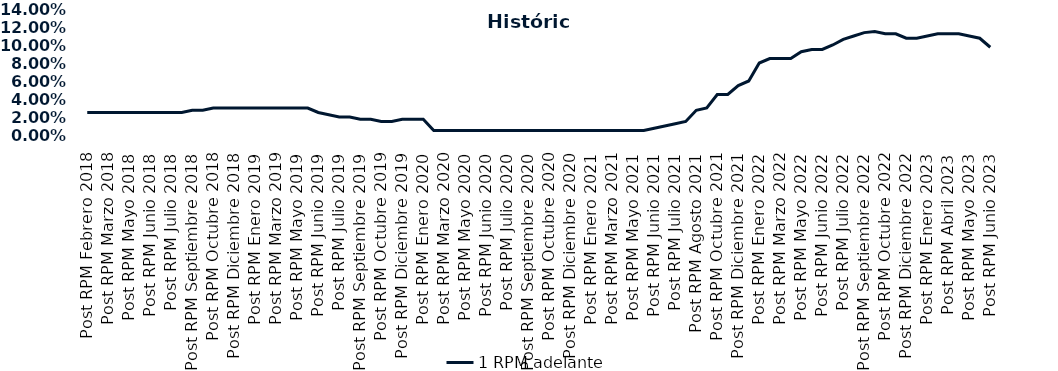
| Category | 1 RPM adelante |
|---|---|
| Post RPM Febrero 2018 | 0.025 |
| Pre RPM Marzo 2018 | 0.025 |
| Post RPM Marzo 2018 | 0.025 |
| Pre RPM Mayo 2018 | 0.025 |
| Post RPM Mayo 2018 | 0.025 |
| Pre RPM Junio 2018 | 0.025 |
| Post RPM Junio 2018 | 0.025 |
| Pre RPM Julio 2018 | 0.025 |
| Post RPM Julio 2018 | 0.025 |
| Pre RPM Septiembre 2018 | 0.025 |
| Post RPM Septiembre 2018 | 0.028 |
| Pre RPM Octubre 2018 | 0.028 |
| Post RPM Octubre 2018 | 0.03 |
| Pre RPM Diciembre 2018 | 0.03 |
| Post RPM Diciembre 2018 | 0.03 |
| Pre RPM Enero 2019 | 0.03 |
| Post RPM Enero 2019 | 0.03 |
| Pre RPM Marzo 2019 | 0.03 |
| Post RPM Marzo 2019 | 0.03 |
| Pre RPM Mayo 2019 | 0.03 |
| Post RPM Mayo 2019 | 0.03 |
| Pre RPM Junio 2019 | 0.03 |
| Post RPM Junio 2019 | 0.025 |
| Pre RPM Julio 2019 | 0.022 |
| Post RPM Julio 2019 | 0.02 |
| Pre RPM Septiembre 2019 | 0.02 |
| Post RPM Septiembre 2019 | 0.018 |
| Pre RPM Octubre 2019 | 0.018 |
| Post RPM Octubre 2019 | 0.015 |
| Pre RPM Diciembre 2019 | 0.015 |
| Post RPM Diciembre 2019 | 0.018 |
| Pre RPM Enero 2020 | 0.018 |
| Post RPM Enero 2020 | 0.018 |
| Pre RPM Marzo 2020 | 0.005 |
| Post RPM Marzo 2020 | 0.005 |
| Pre RPM Mayo 2020 | 0.005 |
| Post RPM Mayo 2020 | 0.005 |
| Pre RPM Junio 2020 | 0.005 |
| Post RPM Junio 2020 | 0.005 |
| Pre RPM Julio 2020 | 0.005 |
| Post RPM Julio 2020 | 0.005 |
| Pre RPM Septiembre 2020 | 0.005 |
| Post RPM Septiembre 2020 | 0.005 |
| Pre RPM Octubre 2020 | 0.005 |
| Post RPM Octubre 2020 | 0.005 |
| Pre RPM Diciembre 2020 | 0.005 |
| Post RPM Diciembre 2020 | 0.005 |
| Pre RPM Enero 2021 | 0.005 |
| Post RPM Enero 2021 | 0.005 |
| Pre RPM Marzo 2021 | 0.005 |
| Post RPM Marzo 2021 | 0.005 |
| Pre RPM Mayo 2021 | 0.005 |
| Post RPM Mayo 2021 | 0.005 |
| Pre RPM Junio 2021 | 0.005 |
| Post RPM Junio 2021 | 0.008 |
| Pre RPM Julio 2021 | 0.01 |
| Post RPM Julio 2021 | 0.012 |
| Pre RPM Agosto 2021 | 0.015 |
| Post RPM Agosto 2021 | 0.028 |
| Pre RPM Octubre 2021 | 0.03 |
| Post RPM Octubre 2021 | 0.045 |
| Pre RPM Diciembre 2021 | 0.045 |
| Post RPM Diciembre 2021 | 0.055 |
| Pre RPM Enero 2022 | 0.06 |
| Post RPM Enero 2022 | 0.08 |
| Pre RPM Marzo 2022 | 0.085 |
| Post RPM Marzo 2022 | 0.085 |
| Pre RPM Mayo 2022 | 0.085 |
| Post RPM Mayo 2022 | 0.092 |
| Pre RPM Junio 2022 | 0.095 |
| Post RPM Junio 2022 | 0.095 |
| Pre RPM Julio 2022 | 0.1 |
| Post RPM Julio 2022 | 0.106 |
| Pre RPM Septiembre 2022 | 0.11 |
| Post RPM Septiembre 2022 | 0.114 |
| Pre RPM Octubre 2022 | 0.115 |
| Post RPM Octubre 2022 | 0.112 |
| Pre RPM Diciembre 2022 | 0.112 |
| Post RPM Diciembre 2022 | 0.108 |
| Pre RPM Enero 2023 | 0.108 |
| Post RPM Enero 2023 | 0.11 |
| Pre RPM Abril 2023 | 0.112 |
| Post RPM Abril 2023 | 0.112 |
| Pre RPM Mayo 2023 | 0.112 |
| Post RPM Mayo 2023 | 0.11 |
| Pre RPM Junio 2023 | 0.108 |
| Post RPM Junio 2023 | 0.098 |